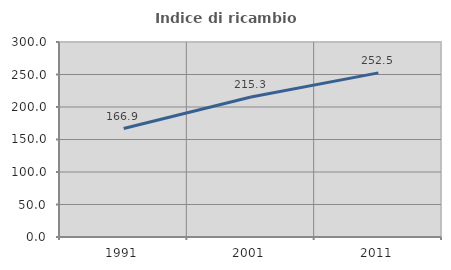
| Category | Indice di ricambio occupazionale  |
|---|---|
| 1991.0 | 166.895 |
| 2001.0 | 215.327 |
| 2011.0 | 252.464 |